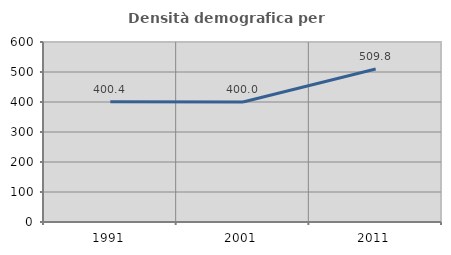
| Category | Densità demografica |
|---|---|
| 1991.0 | 400.437 |
| 2001.0 | 399.996 |
| 2011.0 | 509.757 |